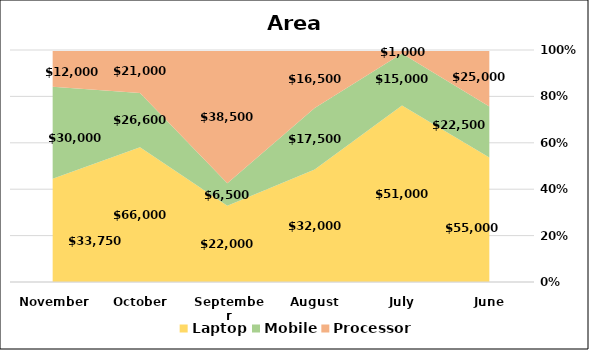
| Category | Laptop | Mobile | Processor |
|---|---|---|---|
| June | 55000 | 22500 | 25000 |
| July | 51000 | 15000 | 1000 |
| August | 32000 | 17500 | 16500 |
| September | 22000 | 6500 | 38500 |
| October | 66000 | 26600 | 21000 |
| November | 33750 | 30000 | 12000 |